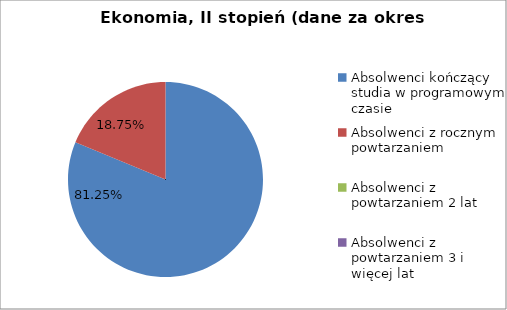
| Category | Series 0 |
|---|---|
| Absolwenci kończący studia w programowym czasie | 81.25 |
| Absolwenci z rocznym powtarzaniem | 18.75 |
| Absolwenci z powtarzaniem 2 lat | 0 |
| Absolwenci z powtarzaniem 3 i więcej lat | 0 |